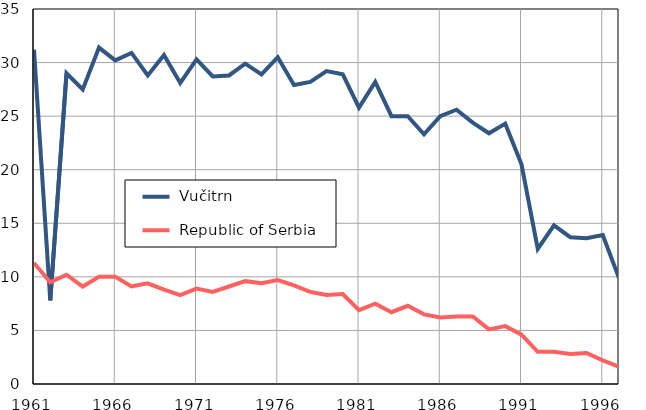
| Category |  Vučitrn |  Republic of Serbia |
|---|---|---|
| 1961.0 | 31.2 | 11.3 |
| 1962.0 | 7.8 | 9.5 |
| 1963.0 | 29 | 10.2 |
| 1964.0 | 27.5 | 9.1 |
| 1965.0 | 31.4 | 10 |
| 1966.0 | 30.2 | 10 |
| 1967.0 | 30.9 | 9.1 |
| 1968.0 | 28.8 | 9.4 |
| 1969.0 | 30.7 | 8.8 |
| 1970.0 | 28.1 | 8.3 |
| 1971.0 | 30.3 | 8.9 |
| 1972.0 | 28.7 | 8.6 |
| 1973.0 | 28.8 | 9.1 |
| 1974.0 | 29.9 | 9.6 |
| 1975.0 | 28.9 | 9.4 |
| 1976.0 | 30.5 | 9.7 |
| 1977.0 | 27.9 | 9.2 |
| 1978.0 | 28.2 | 8.6 |
| 1979.0 | 29.2 | 8.3 |
| 1980.0 | 28.9 | 8.4 |
| 1981.0 | 25.8 | 6.9 |
| 1982.0 | 28.2 | 7.5 |
| 1983.0 | 25 | 6.7 |
| 1984.0 | 25 | 7.3 |
| 1985.0 | 23.3 | 6.5 |
| 1986.0 | 25 | 6.2 |
| 1987.0 | 25.6 | 6.3 |
| 1988.0 | 24.4 | 6.3 |
| 1989.0 | 23.4 | 5.1 |
| 1990.0 | 24.3 | 5.4 |
| 1991.0 | 20.5 | 4.6 |
| 1992.0 | 12.6 | 3 |
| 1993.0 | 14.8 | 3 |
| 1994.0 | 13.7 | 2.8 |
| 1995.0 | 13.6 | 2.9 |
| 1996.0 | 13.9 | 2.2 |
| 1997.0 | 9.9 | 1.6 |